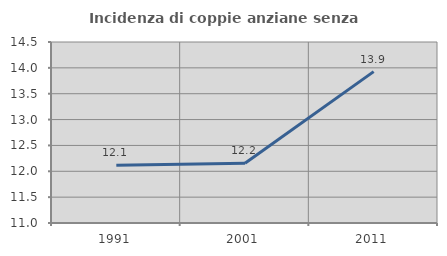
| Category | Incidenza di coppie anziane senza figli  |
|---|---|
| 1991.0 | 12.115 |
| 2001.0 | 12.154 |
| 2011.0 | 13.928 |